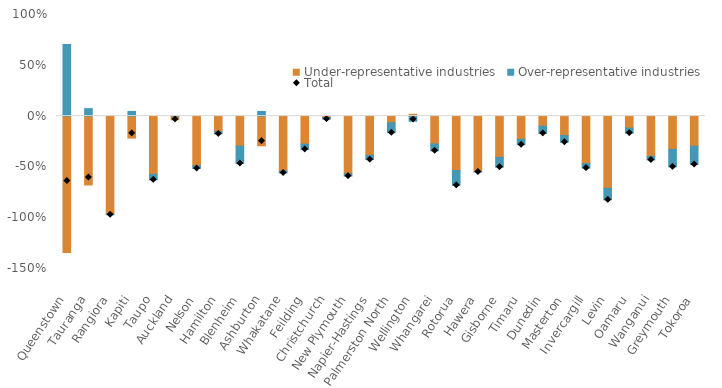
| Category | Under-representative industries | Over-representative industries |
|---|---|---|
| Queenstown | -1.343 | 0.705 |
| Tauranga | -0.678 | 0.073 |
| Rangiora | -0.962 | -0.009 |
| Kapiti | -0.216 | 0.046 |
| Taupo | -0.572 | -0.055 |
| Auckland | -0.036 | 0.004 |
| Nelson | -0.49 | -0.026 |
| Hamilton | -0.153 | -0.023 |
| Blenheim | -0.296 | -0.171 |
| Ashburton | -0.292 | 0.046 |
| Whakatane | -0.54 | -0.02 |
| Feilding | -0.276 | -0.052 |
| Christchurch | -0.015 | -0.015 |
| New Plymouth | -0.568 | -0.022 |
| Napier-Hastings | -0.386 | -0.043 |
| Palmerston North | -0.066 | -0.097 |
| Wellington | 0.018 | -0.051 |
| Whangarei | -0.274 | -0.068 |
| Rotorua | -0.536 | -0.146 |
| Hawera | -0.547 | -0.003 |
| Gisborne | -0.407 | -0.096 |
| Timaru | -0.228 | -0.055 |
| Dunedin | -0.099 | -0.072 |
| Masterton | -0.191 | -0.067 |
| Invercargill | -0.468 | -0.044 |
| Levin | -0.71 | -0.114 |
| Oamaru | -0.117 | -0.05 |
| Wanganui | -0.396 | -0.035 |
| Greymouth | -0.328 | -0.172 |
| Tokoroa | -0.296 | -0.181 |